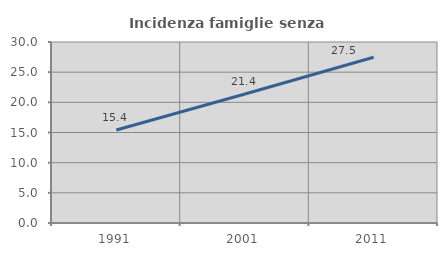
| Category | Incidenza famiglie senza nuclei |
|---|---|
| 1991.0 | 15.41 |
| 2001.0 | 21.38 |
| 2011.0 | 27.462 |